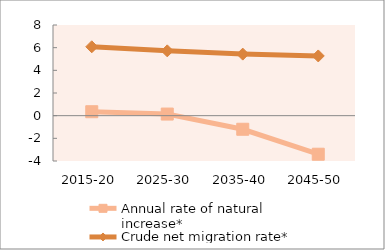
| Category | Annual rate of natural increase* | Crude net migration rate* |
|---|---|---|
| 2015-20 | 0.347 | 6.077 |
| 2025-30 | 0.142 | 5.719 |
| 2035-40 | -1.199 | 5.431 |
| 2045-50 | -3.402 | 5.27 |